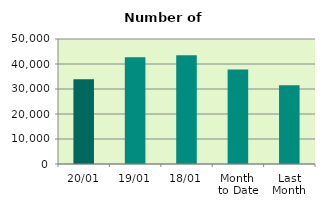
| Category | Series 0 |
|---|---|
| 20/01 | 33854 |
| 19/01 | 42748 |
| 18/01 | 43542 |
| Month 
to Date | 37820.4 |
| Last
Month | 31517.905 |